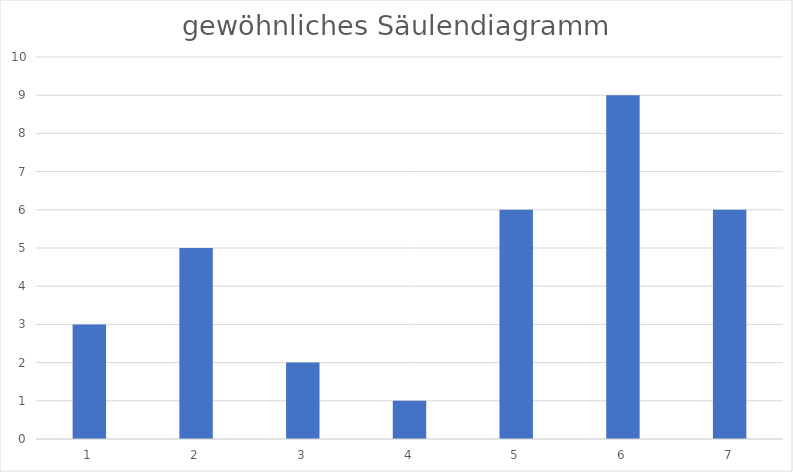
| Category | X |
|---|---|
| 0 | 3 |
| 1 | 5 |
| 2 | 2 |
| 3 | 1 |
| 4 | 6 |
| 5 | 9 |
| 6 | 6 |